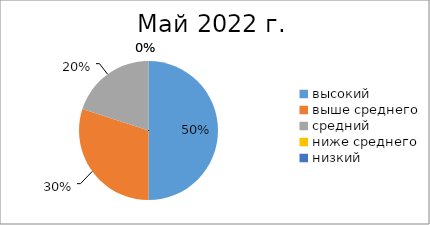
| Category | Series 1 | Series 0 |
|---|---|---|
| высокий | 5 | 2 |
| выше среднего | 3 | 4 |
| средний | 2 | 4 |
| ниже среднего | 0 | 0 |
| низкий | 0 | 0 |